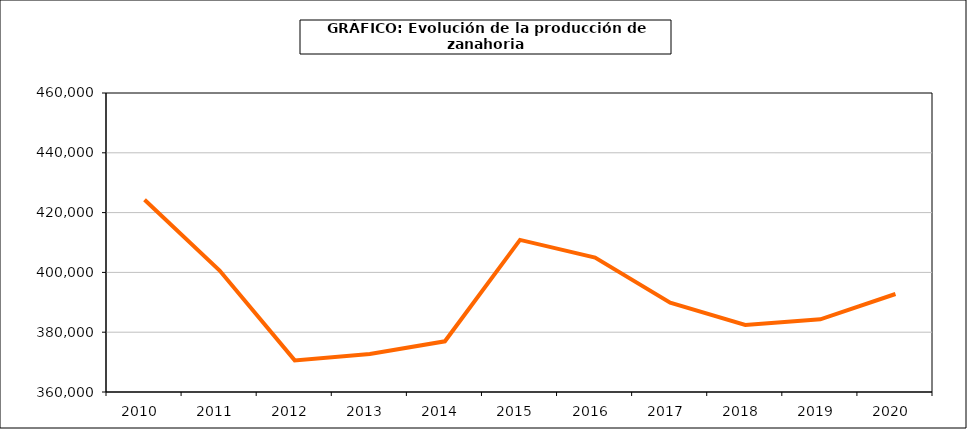
| Category | producción |
|---|---|
| 2010.0 | 424311 |
| 2011.0 | 400628 |
| 2012.0 | 370570 |
| 2013.0 | 372714 |
| 2014.0 | 376952 |
| 2015.0 | 410865 |
| 2016.0 | 404962 |
| 2017.0 | 389844 |
| 2018.0 | 382427 |
| 2019.0 | 384295 |
| 2020.0 | 392774 |